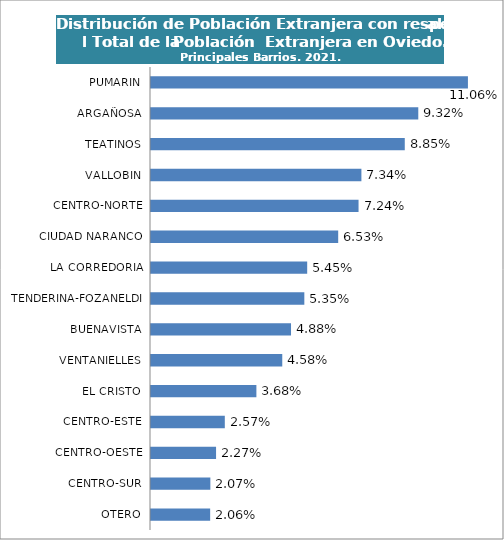
| Category | Series 0 |
|---|---|
| OTERO | 0.021 |
| CENTRO-SUR | 0.021 |
| CENTRO-OESTE | 0.023 |
| CENTRO-ESTE | 0.026 |
| EL CRISTO | 0.037 |
| VENTANIELLES | 0.046 |
| BUENAVISTA | 0.049 |
| TENDERINA-FOZANELDI | 0.053 |
| LA CORREDORIA | 0.054 |
| CIUDAD NARANCO | 0.065 |
| CENTRO-NORTE | 0.072 |
| VALLOBIN | 0.073 |
| TEATINOS | 0.089 |
| ARGAÑOSA | 0.093 |
| PUMARIN | 0.111 |